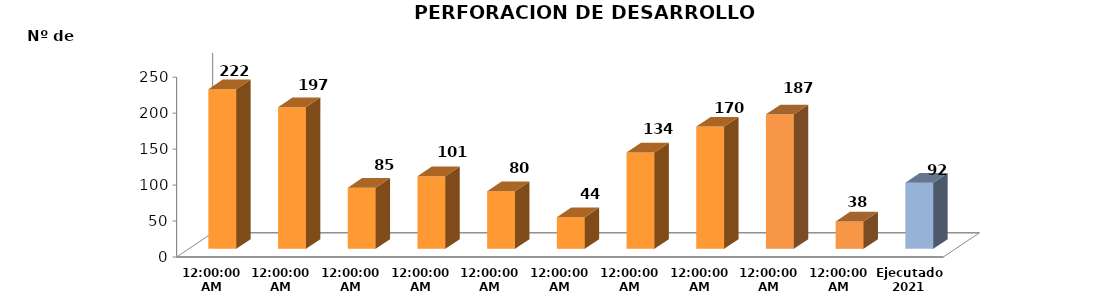
| Category | Series 0 |
|---|---|
| 2011 | 222 |
| 2012 | 197 |
| 2013 | 85 |
| 2014 | 101 |
| 2015 | 80 |
| 2016 | 44 |
| 2017 | 134 |
| 2018 | 170 |
| 2019 | 187 |
| 2020 | 38 |
| Ejecutado
2021 | 92 |